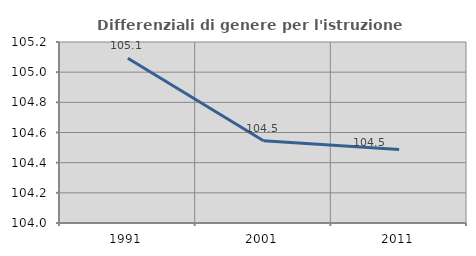
| Category | Differenziali di genere per l'istruzione superiore |
|---|---|
| 1991.0 | 105.092 |
| 2001.0 | 104.545 |
| 2011.0 | 104.487 |